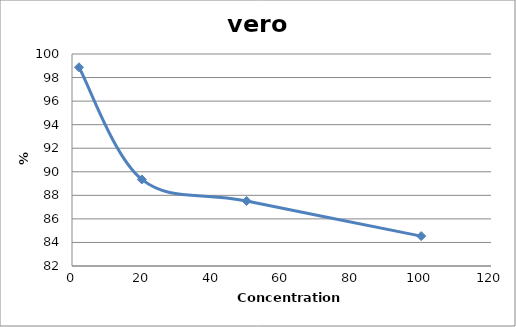
| Category | vero chu2 |
|---|---|
| 100.0 | 84.538 |
| 50.0 | 87.522 |
| 20.0 | 89.349 |
| 2.0 | 98.873 |
| nan | 0 |
| nan | 0 |
| nan | 0 |
| nan | 0 |
| nan | 0 |